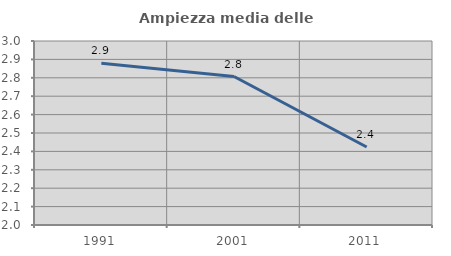
| Category | Ampiezza media delle famiglie |
|---|---|
| 1991.0 | 2.879 |
| 2001.0 | 2.807 |
| 2011.0 | 2.424 |